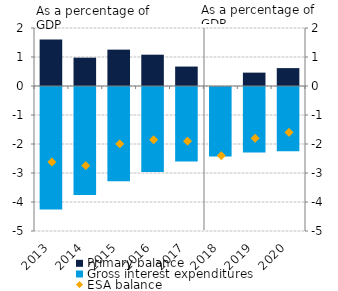
| Category | Primary balance | Gross interest expenditures |
|---|---|---|
| 2013.0 | 1.605 | -4.226 |
| 2014.0 | 0.977 | -3.723 |
| 2015.0 | 1.254 | -3.248 |
| 2016.0 | 1.08 | -2.933 |
| 2017.0 | 0.671 | -2.571 |
| 2018.0 | -0.014 | -2.386 |
| 2019.0 | 0.461 | -2.261 |
| 2020.0 | 0.617 | -2.217 |